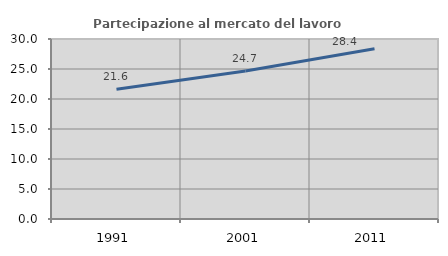
| Category | Partecipazione al mercato del lavoro  femminile |
|---|---|
| 1991.0 | 21.621 |
| 2001.0 | 24.656 |
| 2011.0 | 28.379 |